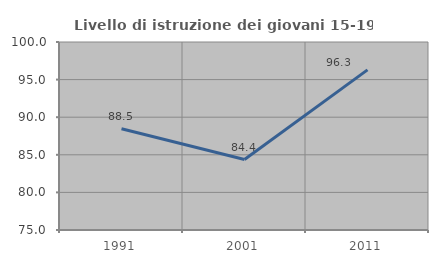
| Category | Livello di istruzione dei giovani 15-19 anni |
|---|---|
| 1991.0 | 88.462 |
| 2001.0 | 84.375 |
| 2011.0 | 96.296 |